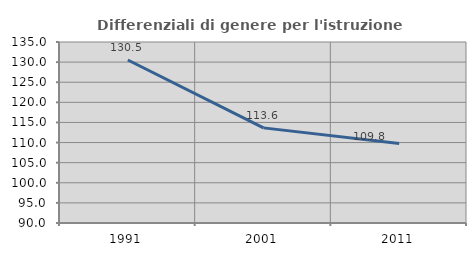
| Category | Differenziali di genere per l'istruzione superiore |
|---|---|
| 1991.0 | 130.525 |
| 2001.0 | 113.649 |
| 2011.0 | 109.791 |